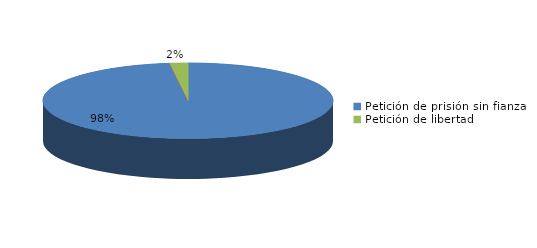
| Category | Series 0 |
|---|---|
| Petición de prisión sin fianza | 48 |
| Peticion de libertad con fianza | 0 |
| Petición de libertad | 1 |